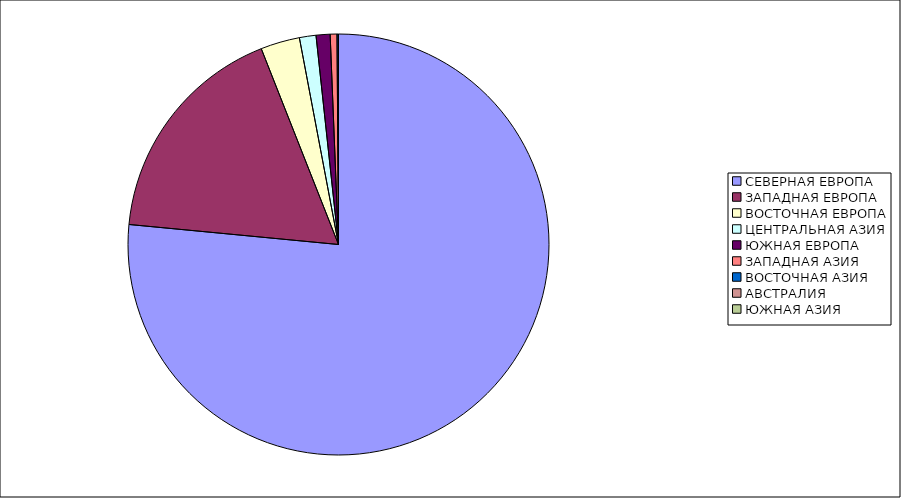
| Category | Оборот |
|---|---|
| СЕВЕРНАЯ ЕВРОПА | 76.516 |
| ЗАПАДНАЯ ЕВРОПА | 17.504 |
| ВОСТОЧНАЯ ЕВРОПА | 3.003 |
| ЦЕНТРАЛЬНАЯ АЗИЯ | 1.27 |
| ЮЖНАЯ ЕВРОПА | 1.074 |
| ЗАПАДНАЯ АЗИЯ | 0.52 |
| ВОСТОЧНАЯ АЗИЯ | 0.109 |
| АВСТРАЛИЯ | 0.003 |
| ЮЖНАЯ АЗИЯ | 0 |